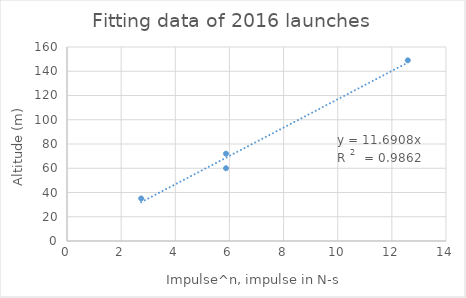
| Category | Series 0 |
|---|---|
| 2.7398955659630437 | 35.06 |
| 5.873094715440096 | 60.003 |
| 12.58925411794168 | 149 |
| 5.873094715440096 | 72 |